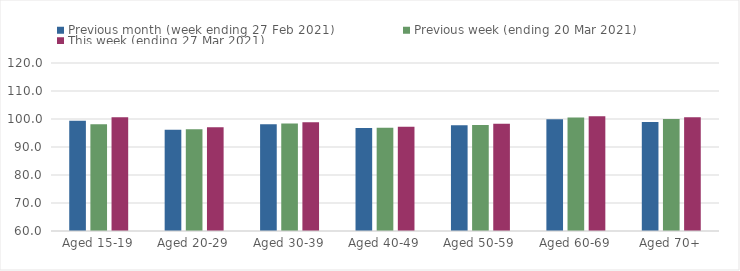
| Category | Previous month (week ending 27 Feb 2021) | Previous week (ending 20 Mar 2021) | This week (ending 27 Mar 2021) |
|---|---|---|---|
| Aged 15-19 | 99.34 | 98.16 | 100.64 |
| Aged 20-29 | 96.12 | 96.35 | 97.03 |
| Aged 30-39 | 98.1 | 98.43 | 98.81 |
| Aged 40-49 | 96.77 | 96.84 | 97.25 |
| Aged 50-59 | 97.78 | 97.89 | 98.33 |
| Aged 60-69 | 99.87 | 100.58 | 100.99 |
| Aged 70+ | 98.93 | 99.98 | 100.6 |